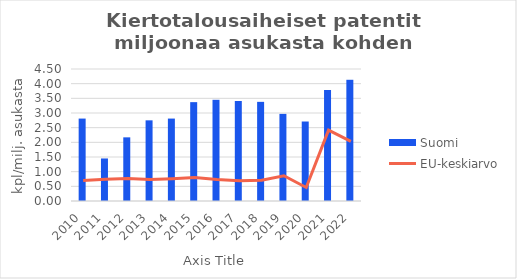
| Category | Suomi |
|---|---|
| 2010.0 | 2.81 |
| 2011.0 | 1.45 |
| 2012.0 | 2.17 |
| 2013.0 | 2.75 |
| 2014.0 | 2.81 |
| 2015.0 | 3.37 |
| 2016.0 | 3.45 |
| 2017.0 | 3.41 |
| 2018.0 | 3.38 |
| 2019.0 | 2.97 |
| 2020.0 | 2.71 |
| 2021.0 | 3.785 |
| 2022.0 | 4.133 |